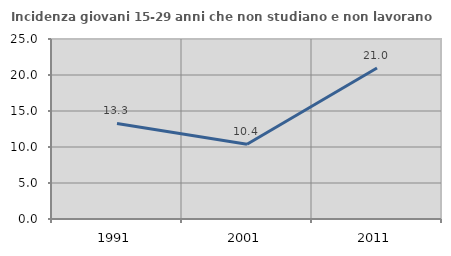
| Category | Incidenza giovani 15-29 anni che non studiano e non lavorano  |
|---|---|
| 1991.0 | 13.276 |
| 2001.0 | 10.373 |
| 2011.0 | 20.974 |